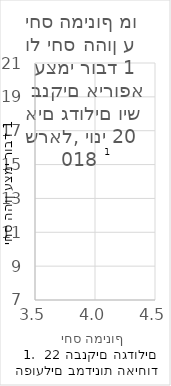
| Category | Series 0 |
|---|---|
| 0 | 10.85 |
| 1 | 10.535 |
| 2 | 12.569 |
| 3 | 11.528 |
| 4 | 11.39 |
| 5 | 13.001 |
| 6 | 15.751 |
| 7 | 13.747 |
| 8 | 13.704 |
| 9 | 12.628 |
| 10 | 15.272 |
| 11 | 14.371 |
| 12 | 16.589 |
| 13 | 14.088 |
| 14 | 14.042 |
| 15 | 11.639 |
| 16 | 13.907 |
| 17 | 19.958 |
| 18 | 11.071 |
| 19 | 14.025 |
| 20 | 16.073 |
| 21 | 12.506 |
| 22 | 11.2 |